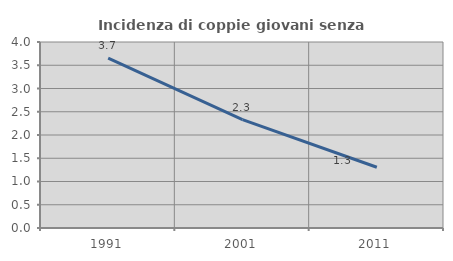
| Category | Incidenza di coppie giovani senza figli |
|---|---|
| 1991.0 | 3.655 |
| 2001.0 | 2.329 |
| 2011.0 | 1.307 |